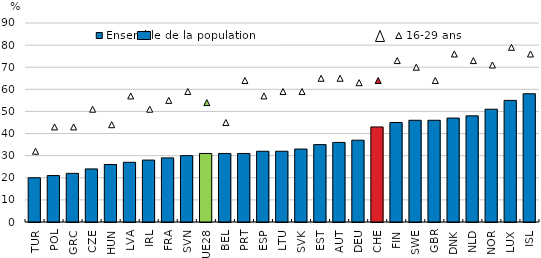
| Category | Ensemble de la population |
|---|---|
| TUR | 20 |
| POL | 21 |
| GRC | 22 |
| CZE | 24 |
| HUN | 26 |
| LVA | 27 |
| IRL | 28 |
| FRA | 29 |
| SVN | 30 |
| UE28 | 31 |
| BEL | 31 |
| PRT | 31 |
| ESP | 32 |
| LTU | 32 |
| SVK | 33 |
| EST | 35 |
| AUT | 36 |
| DEU | 37 |
| CHE | 43 |
| FIN | 45 |
| SWE | 46 |
| GBR | 46 |
| DNK | 47 |
| NLD | 48 |
| NOR | 51 |
| LUX | 55 |
| ISL | 58 |